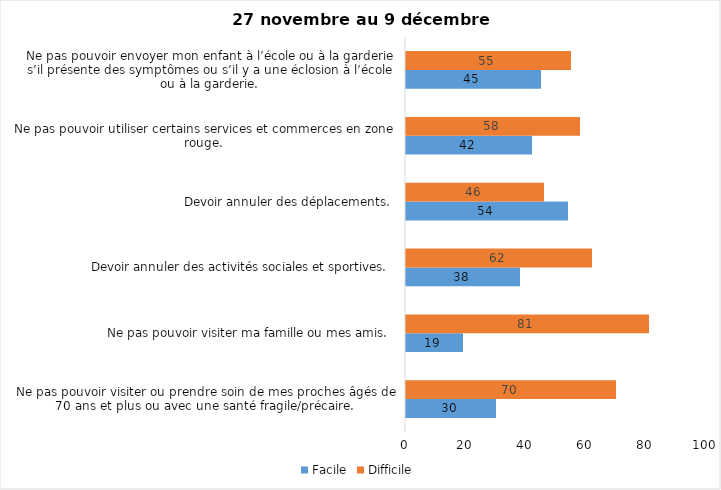
| Category | Facile | Difficile |
|---|---|---|
| Ne pas pouvoir visiter ou prendre soin de mes proches âgés de 70 ans et plus ou avec une santé fragile/précaire.  | 30 | 70 |
| Ne pas pouvoir visiter ma famille ou mes amis.  | 19 | 81 |
| Devoir annuler des activités sociales et sportives.  | 38 | 62 |
| Devoir annuler des déplacements.  | 54 | 46 |
| Ne pas pouvoir utiliser certains services et commerces en zone rouge.  | 42 | 58 |
| Ne pas pouvoir envoyer mon enfant à l’école ou à la garderie s’il présente des symptômes ou s’il y a une éclosion à l’école ou à la garderie.  | 45 | 55 |